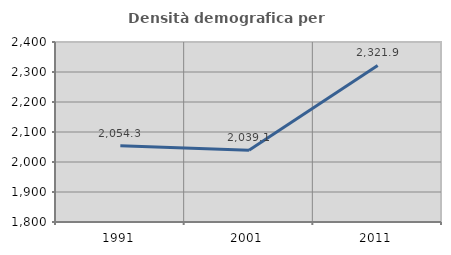
| Category | Densità demografica |
|---|---|
| 1991.0 | 2054.339 |
| 2001.0 | 2039.06 |
| 2011.0 | 2321.872 |